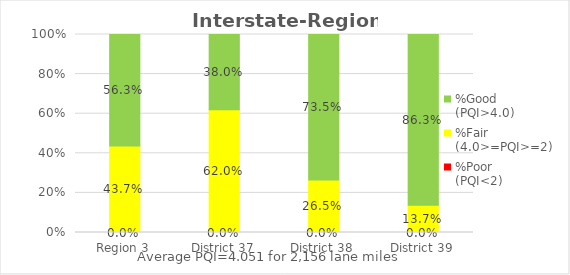
| Category | %Poor
(PQI<2) | %Fair
(4.0>=PQI>=2) | %Good
(PQI>4.0) |
|---|---|---|---|
| Region 3 | 0 | 0.437 | 0.563 |
| District 37 | 0 | 0.62 | 0.38 |
| District 38 | 0 | 0.265 | 0.735 |
| District 39 | 0 | 0.137 | 0.863 |